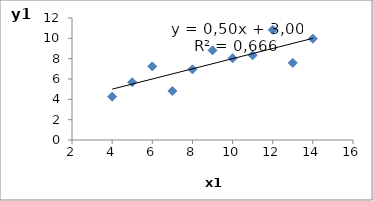
| Category | y1 |
|---|---|
| 10.0 | 8.04 |
| 8.0 | 6.95 |
| 13.0 | 7.58 |
| 9.0 | 8.81 |
| 11.0 | 8.33 |
| 14.0 | 9.96 |
| 6.0 | 7.24 |
| 4.0 | 4.26 |
| 12.0 | 10.84 |
| 7.0 | 4.82 |
| 5.0 | 5.68 |